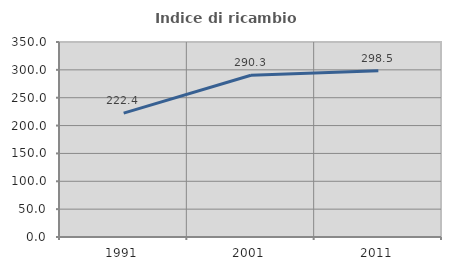
| Category | Indice di ricambio occupazionale  |
|---|---|
| 1991.0 | 222.432 |
| 2001.0 | 290.25 |
| 2011.0 | 298.53 |